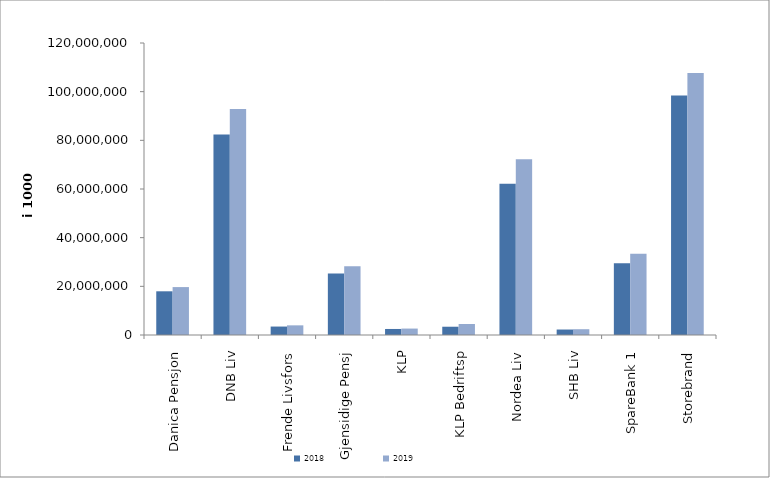
| Category | 2018 | 2019 |
|---|---|---|
| Danica Pensjon | 17958434.743 | 19693741.599 |
| DNB Liv | 82380384 | 92856889.727 |
| Frende Livsfors | 3471864 | 3966911.3 |
| Gjensidige Pensj | 25237226 | 28289547 |
| KLP | 2478827.297 | 2644541.49 |
| KLP Bedriftsp | 3400155 | 4520776 |
| Nordea Liv | 62133840 | 72267840 |
| SHB Liv | 2249653.412 | 2377643.924 |
| SpareBank 1 | 29524731.952 | 33369795.947 |
| Storebrand | 98437461.06 | 107697369.89 |